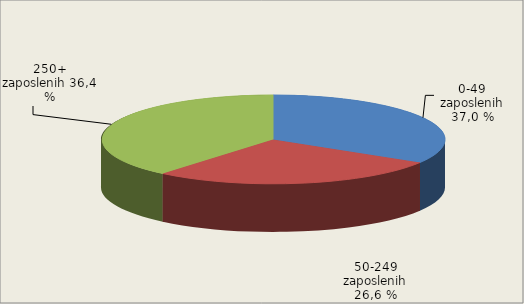
| Category | Broj zaposlenih osoba
Number of persons employed
  |
|---|---|
| 0-49 zaposlenih | 33.71 |
| 50-249 zaposlenih | 27.36 |
| 250+ zaposlenih | 38.93 |